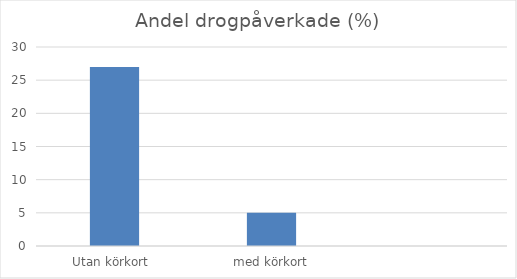
| Category | Andel % |
|---|---|
| Utan körkort  | 27 |
| med körkort | 5 |